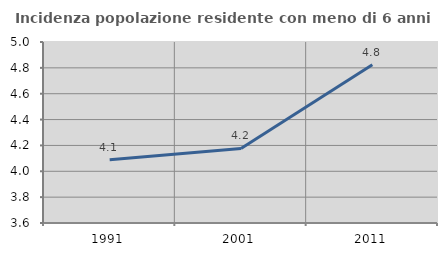
| Category | Incidenza popolazione residente con meno di 6 anni |
|---|---|
| 1991.0 | 4.089 |
| 2001.0 | 4.177 |
| 2011.0 | 4.824 |